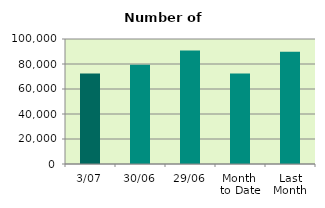
| Category | Series 0 |
|---|---|
| 3/07 | 72316 |
| 30/06 | 79408 |
| 29/06 | 90854 |
| Month 
to Date | 72316 |
| Last
Month | 89884.909 |